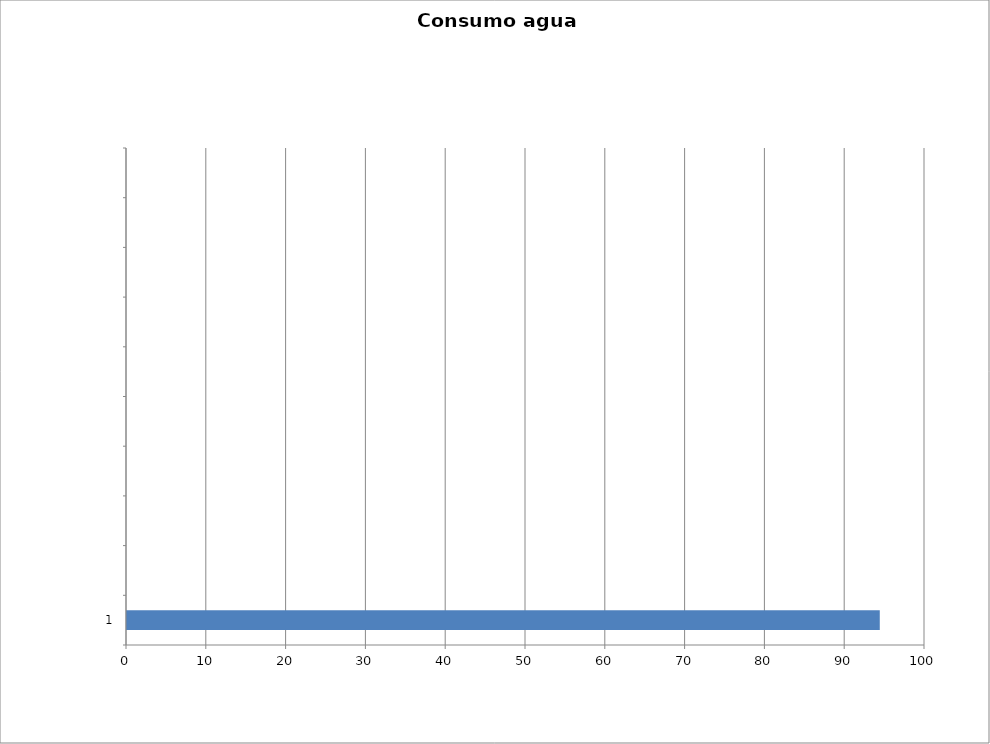
| Category | Series 0 |
|---|---|
| 1 | 94.333 |